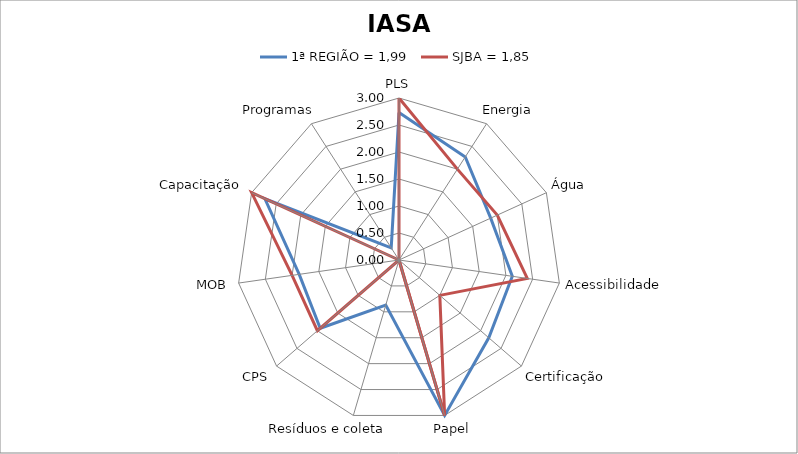
| Category | 1ª REGIÃO = 1,99 | SJBA = 1,85 |
|---|---|---|
| PLS | 2.73 | 3 |
| Energia | 2.27 | 2 |
| Água | 1.867 | 2 |
| Acessibilidade | 2.12 | 2.4 |
| Certificação | 2.2 | 1 |
| Papel | 3 | 3 |
| Resíduos e coleta | 0.87 | 0 |
| CPS | 1.93 | 2 |
| MOB | 1.867 | 2 |
| Capacitação | 2.73 | 3 |
| Programas | 0.267 | 0 |